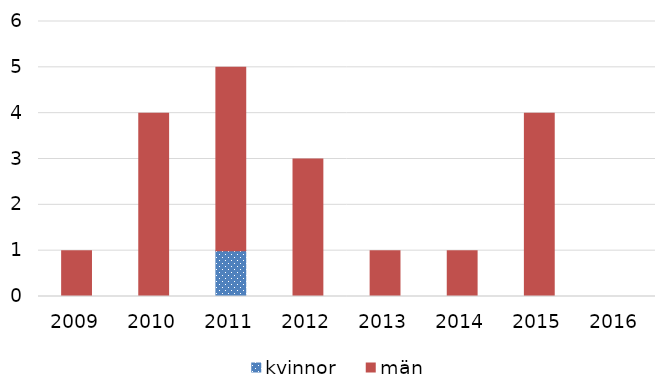
| Category | kvinnor | män |
|---|---|---|
| 2009 | 0 | 1 |
| 2010 | 0 | 4 |
| 2011 | 1 | 4 |
| 2012 | 0 | 3 |
| 2013 | 0 | 1 |
| 2014 | 0 | 1 |
| 2015 | 0 | 4 |
| 2016 | 0 | 0 |